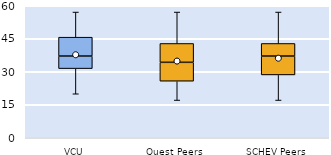
| Category | 25th | 50th | 75th |
|---|---|---|---|
| VCU | 31.429 | 5.714 | 8.571 |
| Quest Peers | 25.714 | 8.571 | 8.571 |
| SCHEV Peers | 28.571 | 8.571 | 5.714 |